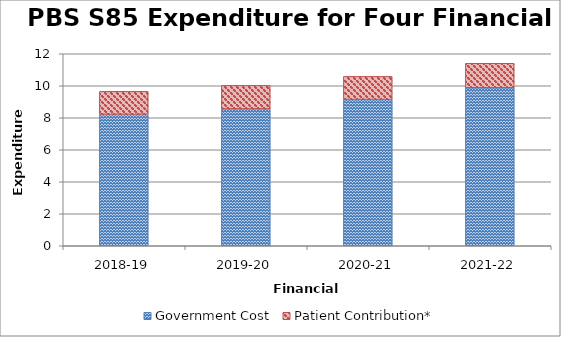
| Category | Government Cost | Patient Contribution* |
|---|---|---|
| 2018-19 | 8211605634.3 | 1440201572.32 |
| 2019-20 | 8552509974.86 | 1471119000.93 |
| 2020-21 | 9136913350.81 | 1450387202.4 |
| 2021-22 | 9872792641.22 | 1534376868.7 |